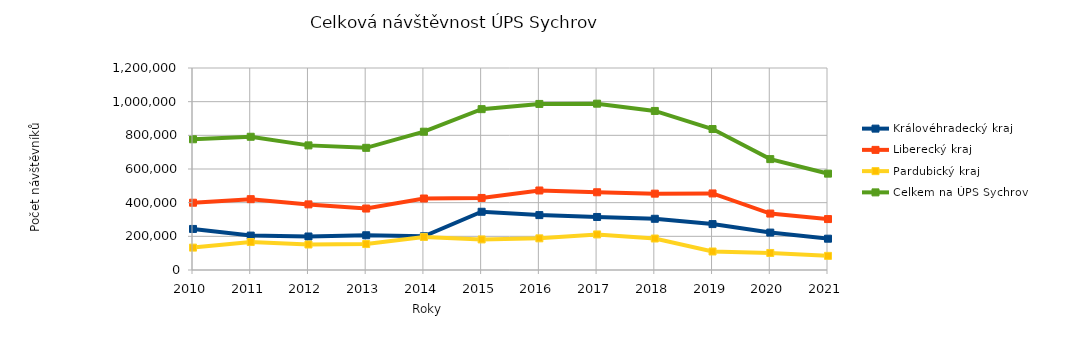
| Category | Královéhradecký kraj | Liberecký kraj | Pardubický kraj | Celkem na ÚPS Sychrov |
|---|---|---|---|---|
| 2010.0 | 243910 | 399672 | 133004 | 776586 |
| 2011.0 | 204481 | 420780 | 166238 | 791499 |
| 2012.0 | 199025 | 389781 | 151509 | 740315 |
| 2013.0 | 206419 | 365108 | 154165 | 725692 |
| 2014.0 | 200438 | 424718 | 196473 | 821629 |
| 2015.0 | 345970 | 428023 | 181567 | 955560 |
| 2016.0 | 326137 | 472318 | 188108 | 986563 |
| 2017.0 | 314983 | 461803 | 211268 | 988054 |
| 2018.0 | 304267 | 453568 | 187017 | 944852 |
| 2019.0 | 272720 | 454785 | 109949 | 837454 |
| 2020.0 | 222238 | 335261 | 101211 | 658710 |
| 2021.0 | 185934 | 302574 | 83925 | 572433 |